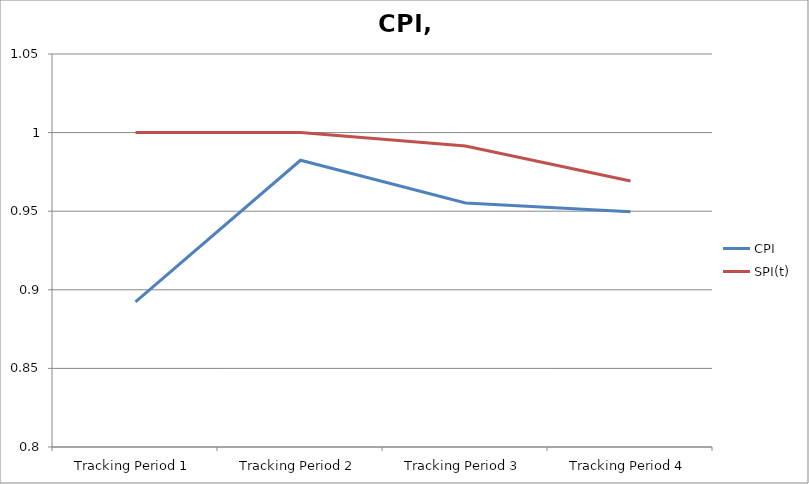
| Category | CPI | SPI(t) |
|---|---|---|
| Tracking Period 1 | 0.892 | 1 |
| Tracking Period 2 | 0.982 | 1 |
| Tracking Period 3 | 0.955 | 0.991 |
| Tracking Period 4 | 0.95 | 0.969 |